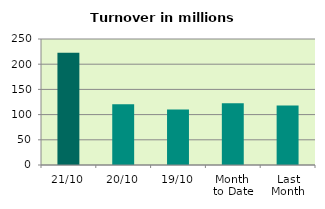
| Category | Series 0 |
|---|---|
| 21/10 | 222.883 |
| 20/10 | 120.571 |
| 19/10 | 110.276 |
| Month 
to Date | 122.657 |
| Last
Month | 117.918 |